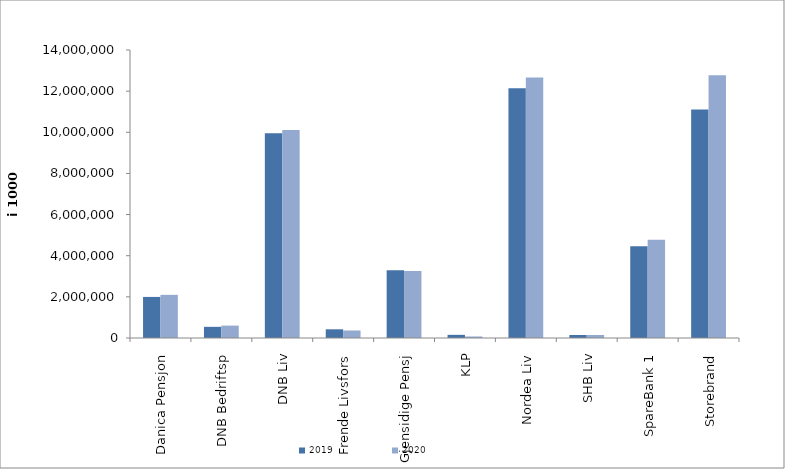
| Category | 2019 | 2020 |
|---|---|---|
| Danica Pensjon | 1996554.923 | 2098292.548 |
| DNB Bedriftsp | 542528 | 601762 |
| DNB Liv | 9947581.5 | 10110496 |
| Frende Livsfors | 423019 | 366321.7 |
| Gjensidige Pensj | 3290851 | 3251091 |
| KLP | 152808.771 | 74308.708 |
| Nordea Liv | 12142064.529 | 12668233 |
| SHB Liv | 145834.708 | 146915.302 |
| SpareBank 1 | 4457595.799 | 4778935.571 |
| Storebrand | 11112376.758 | 12778507.597 |